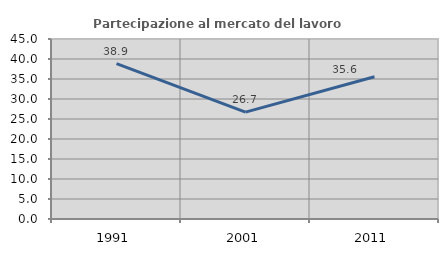
| Category | Partecipazione al mercato del lavoro  femminile |
|---|---|
| 1991.0 | 38.851 |
| 2001.0 | 26.712 |
| 2011.0 | 35.567 |